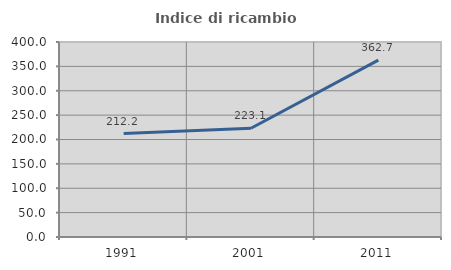
| Category | Indice di ricambio occupazionale  |
|---|---|
| 1991.0 | 212.167 |
| 2001.0 | 223.053 |
| 2011.0 | 362.719 |